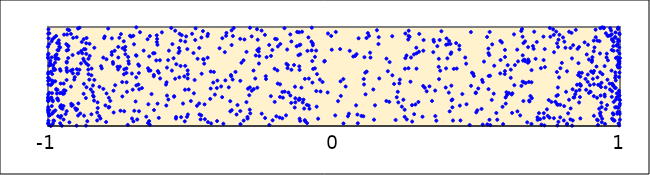
| Category | points |
|---|---|
| -0.43110661353062507 | 1.378 |
| -0.8675651230580735 | 1.282 |
| -0.565033645537927 | 1.827 |
| -0.8745556599280041 | 1.426 |
| 0.9229804409874507 | 1.01 |
| -0.5667209529932022 | 1.56 |
| 0.5402602000727939 | 1.373 |
| 0.9283016239833973 | 1.857 |
| 0.11427688111755352 | 1.549 |
| -0.8802029830275813 | 1.735 |
| -0.13521870981428483 | 1.239 |
| -0.693650932530248 | 1.248 |
| 0.9298636299498789 | 1.126 |
| 0.4291211683478396 | 1.58 |
| -0.1979750586562323 | 1.562 |
| 0.9655121116256414 | 1.913 |
| -0.20163071307384037 | 1.098 |
| 0.7329652501334318 | 1.666 |
| -0.5365397210138435 | 1.606 |
| -0.3020122885303584 | 1.075 |
| 0.46203699761014244 | 1.629 |
| -0.6910025675735528 | 1.41 |
| -0.5115081305963768 | 1.48 |
| 0.24951860649577548 | 1.686 |
| 0.8268158295402106 | 1.788 |
| 0.7798053604449524 | 1.835 |
| -0.72389746824894 | 1.346 |
| -0.059430127182583004 | 1.524 |
| -0.9358822513365613 | 1.827 |
| 0.5457070767478989 | 1.508 |
| 0.7602125747945597 | 1.243 |
| -0.9954528501858785 | 1.335 |
| -0.39467914654680825 | 1.4 |
| -0.12111763473503916 | 1.277 |
| 0.2643529150752365 | 1.901 |
| -0.9130697634604037 | 1.532 |
| -0.4097114934962796 | 1.383 |
| -0.19019378539580775 | 1.085 |
| -0.9140381414422669 | 1.717 |
| 0.391971669928768 | 1.821 |
| 0.13741860519871751 | 1.369 |
| -0.9746129210864114 | 1.452 |
| -0.6503048024994256 | 1.583 |
| -0.7037743616920243 | 1.367 |
| 0.4138486367704635 | 1.268 |
| -0.7466362189584752 | 1.154 |
| -0.9258246845231691 | 1.967 |
| 0.6954879357307139 | 1.807 |
| -0.9999643472417067 | 1.693 |
| 0.9461823946763345 | 1.605 |
| 0.9767737570285722 | 1.807 |
| -0.2878745427499838 | 1.905 |
| -0.8899368804248068 | 1.992 |
| 0.1064651614949364 | 1.695 |
| 0.8220247739148947 | 1.952 |
| -0.5127435108592436 | 1.777 |
| -0.25319050128932363 | 1.964 |
| 0.9726737033415093 | 1.424 |
| 0.8217623339778275 | 1.265 |
| -0.6160538501153433 | 1.555 |
| 0.0817571729877396 | 1.115 |
| -0.9983071085622521 | 1.053 |
| -0.9715411166750687 | 1.909 |
| 0.21003680179347411 | 1.425 |
| -0.22029689065771912 | 1.708 |
| 0.4959966378550189 | 1.338 |
| -0.9954261641146069 | 1.107 |
| 0.5158510821343923 | 1.172 |
| -0.6992822411084932 | 1.825 |
| -0.1373318168872886 | 1.187 |
| 0.9778900913636495 | 1.056 |
| 0.9108898288109826 | 1.794 |
| -0.8732922667616331 | 1.657 |
| -0.6086033877607829 | 1.664 |
| 0.6659633350788666 | 1.67 |
| -0.9997360395635095 | 1.156 |
| -0.88466739640617 | 1.632 |
| 0.5969960906201627 | 1.525 |
| -0.12021541724614296 | 1.074 |
| 0.46335042934097664 | 1.22 |
| 0.9083632721802629 | 1.302 |
| -0.9856212233762313 | 1.332 |
| 0.4014730843263877 | 1.337 |
| -0.586375928791623 | 1.207 |
| 0.7334828710127752 | 1.13 |
| -0.5525824709641152 | 1.075 |
| -0.5399672064739975 | 1.757 |
| 0.9081177428293162 | 1.862 |
| 0.5515000235370819 | 1.263 |
| -0.9780925233450233 | 1.893 |
| -0.8996970208587017 | 1.897 |
| 0.5872107218598053 | 1.844 |
| -0.629855485831215 | 1.517 |
| -0.12031767566631679 | 1.567 |
| -0.41650840865138145 | 1.317 |
| -0.6564040849399265 | 1.094 |
| -0.11827684891413738 | 1.051 |
| 0.998146878813159 | 1.14 |
| -0.281487159251752 | 1.56 |
| -0.4912603594669163 | 1.737 |
| -0.945547102944547 | 1.065 |
| 0.5893232563423979 | 1.194 |
| -0.948004987592298 | 1.324 |
| -0.8266352580266336 | 1.239 |
| -0.31640548037697175 | 1.664 |
| -0.8280807667589556 | 1.136 |
| 0.9712539520978312 | 1.926 |
| 0.9950394553546775 | 1.593 |
| -0.7335523302109845 | 1.149 |
| -0.974292670088214 | 1.711 |
| 0.9225467967567869 | 1.057 |
| -0.782071033040445 | 1.254 |
| -0.18847088031878506 | 1.421 |
| 0.8092729390998774 | 1.79 |
| 0.2951223380989953 | 1.243 |
| 0.9637414784206498 | 1.428 |
| -0.6813535657732642 | 1.371 |
| 0.6755489746414909 | 1.037 |
| 0.1581597281165125 | 1.48 |
| -0.1363889994465944 | 1.397 |
| -0.9916662427075587 | 1.66 |
| 0.5435240167062663 | 1.063 |
| 0.9951578138569918 | 1.026 |
| 0.9887358692526506 | 1.29 |
| 0.9436700528642976 | 1.993 |
| 0.8547593119233721 | 1.635 |
| -0.3406697499220785 | 1.116 |
| 0.9357702133013988 | 1.192 |
| -0.7485180475998339 | 1.6 |
| -0.9574333498311557 | 1.028 |
| 0.9853219565333995 | 1.46 |
| -0.7404588967708055 | 1.444 |
| 0.6573527268074749 | 1.98 |
| -0.5513640041710768 | 1.625 |
| 0.8613770342468582 | 1.076 |
| -0.9863831026081374 | 1.122 |
| 0.07724551194911104 | 1.209 |
| 0.6238190643890696 | 1.33 |
| -0.7198043532856785 | 1.697 |
| -0.9953199707859582 | 1.936 |
| -0.718665692767075 | 1.655 |
| -0.9787140916215684 | 1.053 |
| -0.7723822141728827 | 1.628 |
| -0.00972071948169034 | 1.91 |
| 0.07385244437410768 | 1.707 |
| 0.9319517861103074 | 1.136 |
| -0.16766245073408556 | 1.107 |
| -0.893687437413636 | 1.737 |
| -0.4407661772992247 | 1.931 |
| -0.07374978851323312 | 1.815 |
| 0.9824596125677713 | 1.891 |
| 0.24947272450914693 | 1.934 |
| -0.3817216647521416 | 1.746 |
| 0.27272398090176203 | 1.211 |
| 0.9089945965244346 | 1.556 |
| 0.2287039756227159 | 1.431 |
| -0.19660775239310205 | 1.428 |
| -0.27534240106368907 | 1.48 |
| 0.7507187546833062 | 1.262 |
| -0.9450609063819246 | 1.429 |
| -0.4873364716476675 | 1.465 |
| 0.9823601429441684 | 1.384 |
| 0.99159196730358 | 1.823 |
| -0.32762268218507296 | 1.151 |
| -0.5594500395982299 | 1.297 |
| -0.8427191709987669 | 1.409 |
| -0.6503629297116409 | 1.031 |
| 0.3694229655405735 | 1.869 |
| 0.4101027049744108 | 1.743 |
| -0.07596681293652034 | 1.656 |
| 0.9711669010335852 | 1.294 |
| -0.17247655738904175 | 1.347 |
| 0.5401407044855223 | 1.736 |
| -0.7731592716414425 | 1.646 |
| 0.1882613867004229 | 1.553 |
| -0.49632994168773 | 1.932 |
| -0.9841608553284994 | 1.26 |
| -0.523323538759547 | 1.501 |
| -0.19610663425790018 | 1.804 |
| -0.9441442149177174 | 1.361 |
| 0.8435448104363412 | 1.321 |
| -0.8738849538497535 | 1.104 |
| 0.25445054445177323 | 1.067 |
| -0.9573218243586721 | 1.198 |
| 0.9907926772011564 | 1.612 |
| 0.36645969099130105 | 1.678 |
| -0.9333052610892207 | 1.924 |
| -0.2806355739284743 | 1.373 |
| -0.9645541686292801 | 1.1 |
| -0.22663370900388372 | 1.819 |
| 0.5430980990623235 | 1.716 |
| -0.7017464002223569 | 1.911 |
| -0.31578956705499717 | 1.054 |
| -0.9897912437709727 | 1.283 |
| 0.9973558956088305 | 1.31 |
| 0.39172008254338914 | 1.582 |
| 0.4791910688125067 | 1.406 |
| -0.1807837620359922 | 1.077 |
| -0.806814315865005 | 1.691 |
| 0.4102572778926651 | 1.407 |
| 0.9762919051924148 | 1.063 |
| -0.1213451535502932 | 1.603 |
| 0.26120941099356215 | 1.962 |
| 0.7685453768464536 | 1.92 |
| 0.4786629569993925 | 1.948 |
| -0.5689955922423272 | 1.99 |
| 0.6641865552377106 | 1.44 |
| 0.8949185946908791 | 1.346 |
| 0.9933209402023877 | 1.593 |
| -0.08584744038228985 | 1.174 |
| -0.35795363300329 | 1.966 |
| 0.9722512690500547 | 1.351 |
| -0.816436442494528 | 1.076 |
| 0.9087364272972669 | 1.103 |
| 0.9538336518018019 | 1.73 |
| 0.9499537052287352 | 1.17 |
| 0.9703511573240465 | 1.56 |
| 0.0326893911702987 | 1.474 |
| 0.8377034150522271 | 1.288 |
| 0.9013718833368475 | 1.648 |
| 0.5584842250219968 | 1.327 |
| -0.046894413456895476 | 1.349 |
| 0.6835323258096685 | 1.248 |
| 0.2373146647069223 | 1.195 |
| -0.9989676665276168 | 1.028 |
| -0.17858496128520157 | 1.286 |
| -0.4327347442034078 | 1.274 |
| -0.9606803185840291 | 1.802 |
| -0.6913338617347558 | 1.997 |
| -0.3274986577802649 | 1.456 |
| -0.9996998061715541 | 1.275 |
| -0.6017299698811726 | 1.946 |
| -0.6197795710773939 | 1.916 |
| -0.5608710064515763 | 1.684 |
| -0.9980046492918315 | 1.886 |
| 0.3578218488538949 | 1.054 |
| 0.6005429758937104 | 1.226 |
| -0.16620496485601446 | 1.628 |
| -0.9119753645611566 | 1.89 |
| 0.9730298778731781 | 1.427 |
| 0.7739406952255395 | 1.244 |
| 0.859970851965703 | 1.292 |
| 0.37142533050676074 | 1.559 |
| -0.9664563317015871 | 1.767 |
| 0.9771452565173765 | 1.409 |
| 0.10273213279163933 | 1.098 |
| -0.7400801029654582 | 1.298 |
| -0.6817579265028768 | 1.149 |
| -0.6441644133981259 | 1.013 |
| -0.3868018207700329 | 1.023 |
| -0.26803466458699743 | 1.766 |
| -0.974931344212361 | 1.57 |
| -0.9002089236208274 | 1.003 |
| -0.952015145878257 | 1.337 |
| 0.8464609660217491 | 1.351 |
| -0.15286039580357652 | 1.925 |
| -0.4554872360973859 | 1.671 |
| 0.3613995928236022 | 1.807 |
| 0.8049325963751053 | 1.201 |
| 0.9919384539104723 | 1.142 |
| 0.10393840250390084 | 1.474 |
| 0.11371312670020242 | 1.889 |
| -0.10936207688327931 | 1.238 |
| 0.3934332923788373 | 1.885 |
| 0.866753154192793 | 1.537 |
| -0.04934103254868296 | 1.469 |
| 0.6182767475377758 | 1.569 |
| -0.9137341209585091 | 1.212 |
| 0.5817082963006839 | 1.86 |
| 0.8761971918437386 | 1.845 |
| 0.9965067494341865 | 1.494 |
| 0.44873062343342607 | 1.323 |
| 0.9034809606423204 | 1.695 |
| -0.26250415542352845 | 1.781 |
| -0.29400439212076296 | 1.39 |
| -0.7351788440683398 | 1.856 |
| -0.9818674524030978 | 1.137 |
| -0.9751747583959162 | 1.641 |
| 0.8350154421738645 | 1.056 |
| -0.9864628291041644 | 1.426 |
| 0.3338910638032207 | 1.4 |
| -0.9622377431371294 | 1.865 |
| 0.014110767125181653 | 1.251 |
| -0.30610284764633516 | 1.241 |
| -0.4838874885892624 | 1.986 |
| 0.15636137719492282 | 1.897 |
| -0.12416881627641192 | 1.715 |
| -0.13062524108192147 | 1.805 |
| 0.2470369275274601 | 1.164 |
| -0.5554580062661751 | 1.477 |
| -0.10217358143491427 | 1.059 |
| 0.1093473103488723 | 1.539 |
| -0.062486996320109296 | 1.762 |
| -0.8401730748641456 | 1.297 |
| -0.52795295023756 | 1.227 |
| -0.725112075278887 | 1.442 |
| -0.489844737665879 | 1.33 |
| -0.9187060768651933 | 1.224 |
| -0.9956784867525272 | 1.827 |
| 0.9269624917527208 | 1.174 |
| 0.5530966179173962 | 1.824 |
| -0.07769768908978857 | 1.993 |
| 0.004274529784121353 | 1.107 |
| 0.7359217265969468 | 1.006 |
| -0.8063935170767577 | 1.375 |
| 0.7768679544108034 | 1.953 |
| 0.7661925977038997 | 1.976 |
| 0.6595040154570438 | 1.448 |
| -0.8039454297079232 | 1.887 |
| 0.2693034250152727 | 1.691 |
| 0.5977473533585906 | 1.555 |
| -0.3579874608522647 | 1.818 |
| -0.7391254785789739 | 1.786 |
| 0.12614114696458864 | 1.741 |
| -0.36275966411339844 | 1.251 |
| 0.41400802986279533 | 1.189 |
| -0.12881332164546247 | 1.95 |
| 0.18347106260138663 | 1.68 |
| 0.9962342403281935 | 1.337 |
| -0.7878561348278905 | 1.187 |
| 0.9721120482268213 | 1.876 |
| 0.4043516672168804 | 1.148 |
| -0.6518760263453811 | 1.877 |
| -0.7771567346794019 | 1.719 |
| -0.9999910727218715 | 1.289 |
| 0.978056485265925 | 1.243 |
| -0.8584962404575097 | 1.678 |
| 0.560245798628064 | 1.609 |
| -0.6301031254105608 | 1.502 |
| -0.5522035259694906 | 1.091 |
| -0.5169294442998091 | 1.905 |
| -0.6184691631938011 | 1.879 |
| -0.8503611795558212 | 1.369 |
| -0.9991552291877921 | 1.933 |
| -0.7547865347374965 | 1.571 |
| -0.7311460812762605 | 1.767 |
| -0.9633909715275035 | 1.765 |
| -0.8654653171028994 | 1.392 |
| -0.8146561456546912 | 1.604 |
| 0.9930512708198288 | 1.873 |
| 0.9314893143002467 | 1.988 |
| -0.8938729594726316 | 1.228 |
| -0.842505516206906 | 1.307 |
| -0.2735678907798337 | 1.712 |
| 0.9362645267973434 | 1.038 |
| 0.9954576733430136 | 1.664 |
| -0.9332094786128586 | 1.548 |
| 0.6073817977542978 | 1.614 |
| -0.9903793966606715 | 1 |
| 0.6598040944683583 | 1.714 |
| 0.9966107560968214 | 1.861 |
| 0.3537384685581206 | 1.358 |
| 0.9933041930470073 | 1.851 |
| 0.8115162962833109 | 1.345 |
| 0.9505176503139647 | 1.937 |
| -0.2680929785521744 | 1.387 |
| -0.9344270567266466 | 1.562 |
| 0.1944901207709519 | 1.645 |
| -0.20763038413155893 | 1.578 |
| 0.504371226027156 | 1.379 |
| 0.567666580065673 | 1.132 |
| 0.2470560523711907 | 1.093 |
| -0.7345041967608755 | 1.522 |
| 0.31193671678413 | 1.404 |
| -0.9699127291171105 | 1.723 |
| 0.8147380344928303 | 1.014 |
| -0.9205924602520713 | 1.558 |
| -0.6982231856670497 | 1.153 |
| -0.984392875178889 | 1.876 |
| 0.5009973023501543 | 1.158 |
| -0.8481046902681119 | 1.513 |
| -0.48514245632203146 | 1.869 |
| 0.07889504755166069 | 1.726 |
| -0.9927136920992174 | 1.468 |
| -0.5419916259902133 | 1.789 |
| 0.2802966755044884 | 1.119 |
| -0.5792541201763836 | 1.267 |
| -0.9809550576982885 | 1.055 |
| -0.40873335796004806 | 1.05 |
| -0.543498851518653 | 1.738 |
| -0.9516767455591499 | 1.003 |
| -0.584040956641289 | 1.59 |
| -0.9537699905920448 | 1.21 |
| 0.9889165909889898 | 1.33 |
| 0.9916749683808332 | 1.76 |
| -0.3911068417576902 | 1.291 |
| -0.29455831429871204 | 1.165 |
| -0.45714514163675196 | 1.675 |
| 0.41872070569264597 | 1.577 |
| 0.26034570132056756 | 1.583 |
| 0.31325426545308716 | 1.868 |
| -0.8992109552942142 | 1.574 |
| 0.24808826478789844 | 1.578 |
| -0.729436205462836 | 1.725 |
| -0.09492678743275693 | 1.214 |
| 0.9987093918892583 | 1.927 |
| -0.8665903269505881 | 1.632 |
| -0.9874035893486147 | 1.856 |
| -0.5216370469849716 | 1.047 |
| -0.7448654170872467 | 1.929 |
| -0.8951418579512452 | 1.985 |
| 0.24260025066407054 | 1.265 |
| -0.7012529793380222 | 1.047 |
| -0.4627432274140585 | 1.528 |
| -0.9292433899393814 | 1.687 |
| -0.9970141751531738 | 1.257 |
| -0.14908571958224798 | 1.854 |
| -0.47024915965598807 | 1.116 |
| -0.46640231240042934 | 1.067 |
| -0.15242593224931295 | 1.308 |
| -0.29277500391607303 | 1.128 |
| -0.40772493796662984 | 1.459 |
| -0.6823149659410563 | 1.535 |
| -0.6782862815364921 | 1.947 |
| -0.8968849664400012 | 1.53 |
| 0.342719555259247 | 1.253 |
| -0.9968185661798917 | 1.123 |
| 0.5464148641486289 | 1.009 |
| 0.9999477798273214 | 1.261 |
| -0.8119712950787253 | 1.582 |
| -0.05548254691344489 | 1.074 |
| 0.7917004797018031 | 1.584 |
| 0.8988587967522161 | 1.551 |
| 0.05207078288195826 | 1.124 |
| 0.3542145392577956 | 1.101 |
| -0.07301626303923525 | 1.577 |
| -0.4636097481890704 | 1.893 |
| 0.9710967038967346 | 1.768 |
| 0.9476146905403481 | 1.021 |
| 0.937738181312039 | 1.996 |
| -0.2962652951935015 | 1.311 |
| 0.621212437725728 | 1.319 |
| 0.26740292710748 | 1.447 |
| -0.9993097395071486 | 1.487 |
| 0.8539767316552259 | 1.515 |
| 0.3906265731728773 | 1.388 |
| 0.6813255277632846 | 1.445 |
| 0.2885671383494627 | 1.734 |
| 0.04074482053944721 | 1.399 |
| -0.8754189917906742 | 1.325 |
| -0.9677182378671876 | 1.277 |
| 0.9841780810429905 | 1.945 |
| 0.955013110292872 | 1.211 |
| -0.0744139935621312 | 1.834 |
| -0.706560984122548 | 1.53 |
| -0.1803982632252392 | 1.344 |
| 0.4159691390608392 | 1.055 |
| -0.8741972354642118 | 1.776 |
| -0.6714469426619607 | 1.383 |
| 0.991441508319422 | 1.695 |
| 0.6553025216128916 | 1.405 |
| -0.8949420197223121 | 1.106 |
| 0.08318598080659707 | 1.028 |
| 0.8624139506304787 | 1.412 |
| 0.9300903708840822 | 1.733 |
| 0.678637960288275 | 1.796 |
| -0.6905608387719678 | 1.71 |
| -0.8581794887224845 | 1.523 |
| -0.10047627654978925 | 1.047 |
| -0.8208474316847707 | 1.101 |
| 0.9529612467600393 | 1.693 |
| 0.8454482932875669 | 1.971 |
| 0.6293757149800862 | 1.926 |
| -0.9345401693011139 | 1.763 |
| -0.5799782384176351 | 1.665 |
| -0.021067941661173397 | 1.934 |
| 0.6413801083199803 | 1.148 |
| 0.9902434323894701 | 1.124 |
| -0.999927342423154 | 1.255 |
| -0.8547468875319925 | 1.83 |
| -0.5875581280927819 | 1.419 |
| 0.8912567481976925 | 1.334 |
| -0.6169999734995649 | 1.226 |
| -0.7766224522413876 | 1.885 |
| -0.9782873669681214 | 1.565 |
| -0.16381427005017565 | 1.772 |
| -0.9831177374774159 | 1.439 |
| 0.8362010754970619 | 1.816 |
| -0.7992507945229245 | 1.208 |
| -0.6126879851253287 | 1.537 |
| 0.9325004603262506 | 1.101 |
| 0.6226979142262538 | 1.132 |
| -0.5209642599671491 | 1.366 |
| -0.5587509910234111 | 1.3 |
| -0.9978166566361972 | 1.484 |
| -0.3236475107932749 | 1.639 |
| 0.9829809983525116 | 1.488 |
| 0.12766462992433175 | 1.691 |
| -0.9992016852991381 | 1.319 |
| 0.779213510364138 | 1.546 |
| 0.3660928072596453 | 1.598 |
| 0.997249935738251 | 1.794 |
| -0.9893660527088086 | 1.618 |
| -0.7063132974866355 | 1.075 |
| -0.9999660389080288 | 1.801 |
| 0.8627748070079422 | 1.407 |
| -0.5363972134958175 | 1.863 |
| -0.24149683185661777 | 1.921 |
| 0.4400943443170008 | 1.206 |
| -0.9010127107475413 | 1.161 |
| -0.9458159888835085 | 1.202 |
| 0.9749140158089197 | 1.128 |
| -0.9829492098726095 | 1.024 |
| 0.691877669463342 | 1.281 |
| 0.6625992426335098 | 1.838 |
| -0.6655767935188049 | 1.761 |
| 0.9376769676138397 | 1.074 |
| -0.7543575643381665 | 1.799 |
| -0.3760139280419895 | 1.94 |
| 0.9772343214737346 | 1.76 |
| -0.9731071045291854 | 1.677 |
| -0.9083797047524189 | 1.469 |
| 0.938672801212111 | 1.523 |
| 0.5352819311139156 | 1.899 |
| -0.34436959932108835 | 1.546 |
| -0.9138022838055766 | 1.569 |
| 0.914633952951666 | 1.973 |
| 0.8146830524106091 | 1.552 |
| -0.2875600976447335 | 1.356 |
| -0.992869752448392 | 1.637 |
| -0.9344428807383703 | 1.64 |
| -0.6326162010520785 | 1.734 |
| -0.35762388353936014 | 1.16 |
| 0.7835606230193695 | 1.798 |
| -0.13517226986939557 | 1.28 |
| 0.9468063747135925 | 1.299 |
| -0.4791742230113522 | 1.204 |
| -0.8555109305186173 | 1.468 |
| 0.9199109360433668 | 1.285 |
| -0.3373780232484978 | 1.212 |
| -0.890047223303669 | 1.568 |
| 0.28830580461260197 | 1.579 |
| 0.5811665146894854 | 1.531 |
| -0.934654243414466 | 1.15 |
| 0.22477910062624865 | 1.239 |
| -0.8650978147833057 | 1.889 |
| 0.69044917224509 | 1.021 |
| 0.9972045621414644 | 1.007 |
| 0.9688530203047088 | 1.965 |
| 0.7827702121937301 | 1.389 |
| 0.02392198761391631 | 1.304 |
| -0.2612050595878621 | 1.706 |
| 0.15011345787612398 | 1.967 |
| 0.9495695020046968 | 1.39 |
| -0.956130926573564 | 1.558 |
| 0.7689290721790473 | 1.079 |
| -0.5325456673213178 | 1.917 |
| 0.5708504088751432 | 1.063 |
| -0.7504635588234433 | 1.891 |
| -0.11935089976144969 | 1.269 |
| -0.88398281771672 | 1.757 |
| -0.3269442470162636 | 1.019 |
| 0.6593120014740106 | 1.902 |
| 0.23036381381963386 | 1.469 |
| 0.1554853042726548 | 1.828 |
| 0.03314889707053818 | 1.026 |
| -0.8764533054034561 | 1.679 |
| 0.9872604373795502 | 1.191 |
| -0.7296276214877346 | 1.8 |
| 0.8266419038895952 | 1.067 |
| 0.9985781608201354 | 1.209 |
| 0.883750351050282 | 1.723 |
| -0.5853398471684271 | 1.441 |
| 0.3479421801248333 | 1.87 |
| -0.09410302601172221 | 1.029 |
| 0.8870722305230151 | 1.446 |
| 0.04877757711809636 | 1.099 |
| -0.7871826971874075 | 1.285 |
| 0.6116541923678466 | 1.332 |
| 0.4974899891219281 | 1.138 |
| -0.9686675597315206 | 1.685 |
| -0.033794898644011535 | 1.651 |
| 0.9981867860616576 | 1.732 |
| 0.998241097317301 | 1.54 |
| -0.8625573874096385 | 1.048 |
| 0.9847759153859195 | 1.385 |
| 0.7546379166252316 | 1.99 |
| 0.32402259633167974 | 1.35 |
| 0.781914401548916 | 1.213 |
| 0.6824649302643038 | 1.257 |
| 0.7693760330327354 | 1.745 |
| -0.8434253392109258 | 1.342 |
| -0.29363312073982106 | 1.992 |
| 0.7339807079673207 | 1.082 |
| 0.517872815544883 | 1.466 |
| -0.9819793316285673 | 1.614 |
| -0.09275103215467854 | 1.759 |
| 0.7811971507042386 | 1.005 |
| 0.8567907329621085 | 1.798 |
| 0.7909894948042377 | 1.215 |
| 0.8613757345482818 | 1.498 |
| -0.9982547354908237 | 1.73 |
| 0.5999658117237425 | 1.288 |
| -0.9989960671749828 | 1.542 |
| -0.7668429493911949 | 1.76 |
| -0.8690669237996338 | 1.776 |
| 0.9847444262648221 | 1.509 |
| -0.9992833967950202 | 1.19 |
| -0.9687203854783502 | 1.329 |
| -0.9297236005466109 | 1.811 |
| 0.2733503416672558 | 1.045 |
| 0.9195988309702744 | 1.064 |
| 0.7376069668079859 | 1.595 |
| 0.9944120245132353 | 1.66 |
| -0.8542299632914239 | 1.708 |
| -0.9997614412796988 | 1.686 |
| 0.8320110081847037 | 1.683 |
| -0.5141014161618882 | 1.092 |
| -0.9870055708441984 | 1.693 |
| -0.9845488871774387 | 1.458 |
| 0.7849879206429281 | 1.872 |
| -0.4714639172437137 | 1.228 |
| -0.07814320741646859 | 1.763 |
| 0.9973707159485036 | 1.267 |
| -0.8592281918109247 | 1.57 |
| -0.733336714909764 | 1.572 |
| 0.1398861379059013 | 1.064 |
| -0.08945670332737281 | 1.895 |
| 0.7908901806387458 | 1.088 |
| 0.8516903554234445 | 1.779 |
| -0.45379467201296975 | 1.629 |
| -0.1397362857632896 | 1.616 |
| 0.7565516356913717 | 1.901 |
| -0.390469107618288 | 1.887 |
| -0.04014555275623403 | 1.444 |
| -0.6845580436976241 | 1.621 |
| 0.7779733335839051 | 1.304 |
| 0.894726218264674 | 1.413 |
| -0.07907946801499814 | 1.853 |
| 0.8584553433702753 | 1.364 |
| -0.10190046926057077 | 1.476 |
| 0.9589131567638701 | 1.911 |
| 0.977344009237952 | 1.116 |
| -0.5116171068139359 | 1.561 |
| -0.6915732261518385 | 1.491 |
| -0.9896028835093081 | 1.548 |
| -0.20024111471833947 | 1.876 |
| -0.8945166675456631 | 1.53 |
| -0.5838926163422926 | 1.307 |
| -0.938426007736971 | 1.121 |
| 0.26062724622489186 | 1.91 |
| 0.9436362559549734 | 1.989 |
| 0.7114097535690522 | 1.087 |
| 0.6704600080092684 | 1.434 |
| 0.9334772388557798 | 1.393 |
| -0.20607347449784646 | 1.88 |
| -0.7570765614613572 | 1.598 |
| -0.06661584336220086 | 1.582 |
| 0.7846621567276354 | 1.042 |
| -0.9197410171078673 | 1.398 |
| 0.9089575586735058 | 1.421 |
| 0.9207335752858443 | 1.863 |
| 0.6979705372844941 | 1.779 |
| -0.18883840242792485 | 1.294 |
| 0.2796121903362587 | 1.723 |
| -0.3678837732950837 | 1.39 |
| 0.6509773348918592 | 1.107 |
| -0.4582239192879751 | 1.959 |
| -0.9634056729673572 | 1.678 |
| -0.9998325688369252 | 1.168 |
| 0.19325243470007106 | 1.244 |
| -0.12355799084099349 | 1.263 |
| -0.21468724283547438 | 1.058 |
| -0.7702740363231727 | 1.137 |
| -0.4407378307709266 | 1.039 |
| 0.8324992300414173 | 1.003 |
| -0.23567259018079298 | 1.695 |
| 0.997717213214053 | 1.63 |
| 0.1832265213717561 | 1.253 |
| -0.7257778259421102 | 1.536 |
| -0.061875173167907256 | 1.353 |
| -0.8819669703358182 | 1.849 |
| -0.9580091334335642 | 1.573 |
| -0.6172862560050855 | 1.82 |
| 0.6905883662406448 | 1.442 |
| 0.6046231740239145 | 1.311 |
| 0.11025360897465673 | 1.32 |
| -0.95698645333536 | 1.085 |
| -0.9710329848967221 | 1.374 |
| -0.9389606770222896 | 1.357 |
| -0.9313679849004718 | 1.974 |
| -0.9799391650583444 | 1.585 |
| -0.6474221759134633 | 1.559 |
| -0.2074039336858992 | 1.244 |
| 0.6324757496862465 | 1.615 |
| -0.5107851123552956 | 1.116 |
| -0.4200335078125359 | 1.546 |
| -0.6924993930377669 | 1.714 |
| 0.4867048297822606 | 1.529 |
| -0.9982635336708664 | 1.977 |
| -0.8390736710665966 | 1.257 |
| -0.7769448479181562 | 1.747 |
| 0.37555122088045123 | 1.957 |
| -0.16246316126805893 | 1.584 |
| -0.9868550189710779 | 1.201 |
| -0.5201041202294417 | 1.607 |
| 0.9236894805139774 | 1.416 |
| -0.16134493515943307 | 1.615 |
| -0.21564417668235342 | 1.768 |
| -0.8672079098425756 | 1.004 |
| 0.9211630138901171 | 1.491 |
| -0.8984724855885744 | 1.169 |
| 0.5914422583829296 | 1.019 |
| -0.2692600771340881 | 1.978 |
| -0.9740368908810126 | 1.693 |
| -0.22612147599303511 | 1.01 |
| 0.9972655635547695 | 1.935 |
| 0.6306518221129767 | 1.412 |
| -0.14891081502142084 | 1.568 |
| 0.31236845210450903 | 1.761 |
| -0.9575845850206003 | 1.793 |
| -0.36259246834853615 | 1.148 |
| -0.641776483055899 | 1.56 |
| -0.26331435621366506 | 1.752 |
| -0.6292972194100042 | 1.161 |
| -0.9906818898291627 | 1.413 |
| 0.2036304052033043 | 1.907 |
| 0.980951300612667 | 1.055 |
| -0.9678689731322173 | 1.84 |
| 0.8009208701226541 | 1.894 |
| -0.4295964535401545 | 1.026 |
| 0.3175451566786428 | 1.386 |
| 0.9560857700764605 | 1.468 |
| 0.9926253652973606 | 1.979 |
| -0.8475030163147249 | 1.58 |
| -0.995581878254738 | 1.61 |
| 0.4382179602210061 | 1.774 |
| 0.8597521398592777 | 1.424 |
| -0.8380128612632937 | 1.79 |
| -0.9955885618572639 | 1.161 |
| 0.6685654594960343 | 1.654 |
| 0.9977762608378165 | 1.653 |
| 0.7166043871840402 | 1.13 |
| 0.8794600267833672 | 1.475 |
| 0.7825073258280838 | 1.313 |
| 0.6179818535811598 | 1.487 |
| -0.7541877896003092 | 1.692 |
| -0.9063969110720147 | 1.493 |
| -0.1216740625391325 | 1.947 |
| 0.8497605817038939 | 1.417 |
| -0.8751397661197096 | 1.877 |
| 0.30945661362729426 | 1.093 |
| 0.725385125527704 | 1.014 |
| 0.93213484363531 | 1.308 |
| 0.9938118315616273 | 1.994 |
| -0.4425175001239536 | 1.908 |
| -0.9349219685289983 | 1.465 |
| 0.8186454333857361 | 1.128 |
| -0.08830040985926041 | 1.207 |
| -0.6435511153796695 | 1.909 |
| 0.2845565310924461 | 1.217 |
| -0.2528225266951981 | 1.125 |
| -0.8663363571879935 | 1.836 |
| -0.5112627462172162 | 1.523 |
| -0.12179543440038217 | 1.815 |
| -0.9879726440165357 | 1.286 |
| 0.9722824952618351 | 1.074 |
| -0.471104095380732 | 1.789 |
| -0.7134253917655545 | 1.911 |
| -0.4001816316192609 | 1.785 |
| 0.6548794159716751 | 1.959 |
| -0.08795263506644682 | 1.479 |
| -0.9611704971430826 | 1.833 |
| 0.2536103180734326 | 1.712 |
| -0.9294147807188609 | 1.77 |
| 0.9850125413000889 | 1.265 |
| -0.159154233814768 | 1.338 |
| -0.1494217008571504 | 1.234 |
| -0.94392013085392 | 1.923 |
| 0.20414526848939307 | 1.512 |
| -0.8591874051232253 | 1.615 |
| -0.9286793891862223 | 1.806 |
| -0.6379513552171893 | 1.323 |
| 0.7089660788658048 | 1.849 |
| -0.022151767198828116 | 1.339 |
| 0.6434281005486926 | 1.652 |
| -0.30096010497760634 | 1.377 |
| -0.96708369357191 | 1.365 |
| -0.5345914001197936 | 1.089 |
| 0.7535793432852391 | 1.084 |
| -0.8872936739830027 | 1.127 |
| -0.43096022350284613 | 1.55 |
| 0.9855596794344954 | 1.687 |
| 0.48891620381834205 | 1.506 |
| 0.1434007423567164 | 1.209 |
| -0.10654424439050864 | 1.267 |
| 0.9730227282482216 | 1.869 |
| -0.5398816396017759 | 1.931 |
| -0.7089040150626972 | 1.902 |
| -0.4515417213154663 | 1.069 |
| -0.7857589172621503 | 1.192 |
| 0.7966480957816693 | 1.637 |
| 0.9987399887937396 | 1.594 |
| 0.5443192405730053 | 1.95 |
| -0.999148388031391 | 1.139 |
| 0.8881623148993484 | 1.82 |
| -0.9584986902969447 | 1.332 |
| -0.11396192037643132 | 1.387 |
| -0.6839193799159461 | 1.419 |
| 0.8574424044224318 | 1.538 |
| -0.220804910928096 | 1.301 |
| -0.9197297870685605 | 1.93 |
| 0.744533382018619 | 1.168 |
| 0.21549100237554394 | 1.061 |
| -0.7650203844005543 | 1.412 |
| 0.7048573594160267 | 1.678 |
| -0.17309315446875667 | 1.988 |
| -0.5407860379546836 | 1.492 |
| -0.9993758970634389 | 1.253 |
| 0.9082725195670517 | 1.755 |
| -0.4642221007517488 | 1.107 |
| -0.9350063468606491 | 1.585 |
| 0.8971398343654183 | 1.344 |
| 0.9836712794276498 | 1.542 |
| 0.4825712640056327 | 1.538 |
| -0.9797304495290867 | 1.145 |
| -0.5078969941901903 | 1.369 |
| 0.999743861053175 | 1.064 |
| -0.974378284098677 | 1.157 |
| -0.07539275479498292 | 1.438 |
| 0.43819584292490693 | 1.813 |
| 0.840387213063008 | 1.289 |
| -0.30589344386786255 | 1.749 |
| -0.4221250563507045 | 1.439 |
| -0.5770881770991645 | 1.761 |
| -0.2386145894284942 | 1.503 |
| 0.36724434414350676 | 1.473 |
| -0.9994968153178676 | 1.526 |
| -0.3130429723738133 | 1.874 |
| 0.5978051912707538 | 1.769 |
| -0.7172699542841584 | 1.63 |
| 0.987917949480933 | 1.812 |
| -0.6462984063474633 | 1.05 |
| 0.7801171986775606 | 1.221 |
| 0.9062396531656265 | 1.536 |
| 0.917791905313347 | 1.601 |
| 0.2194417621817584 | 1.29 |
| 0.5980104918689274 | 1.697 |
| -0.11775753073359405 | 1.821 |
| -0.9793569494233738 | 1.571 |
| 0.935436924127269 | 1.436 |
| 0.9987691138551693 | 1.121 |
| 0.9974043411737129 | 1.646 |
| 0.8304697192617925 | 1.941 |
| -0.9829186696097015 | 1.249 |
| 0.9656871142154928 | 1.988 |
| -0.8261417236771346 | 1.182 |
| -0.10446799815358437 | 1.176 |
| 0.8569743143975074 | 1.238 |
| -0.5552629295538201 | 1.963 |
| -0.8660771125378847 | 1.728 |
| -0.7213252762324649 | 1.011 |
| 0.8342537331227498 | 1.371 |
| 0.9565185345545786 | 1.912 |
| 0.9305314379739059 | 1.542 |
| 0.42701124694930187 | 1.837 |
| -0.6079592262177507 | 1.48 |
| -0.9556256751892849 | 1.184 |
| 0.6405326047260032 | 1.771 |
| -0.646039396593188 | 1.703 |
| -0.4769493806091829 | 1.679 |
| 0.5244546115694735 | 1.651 |
| 0.9577843371272928 | 1.663 |
| -0.6215665460003466 | 1.663 |
| -0.7952871656926648 | 1.329 |
| 0.4742074834348875 | 1.01 |
| -0.3542930074447206 | 1.469 |
| -0.6880484506221775 | 1.066 |
| 0.8914244438166985 | 1.671 |
| 0.9464382454874938 | 1.318 |
| -0.9995564905949559 | 1.025 |
| 0.054943977700094 | 1.759 |
| 0.4588527314563858 | 1.691 |
| -0.06654156140691546 | 1.699 |
| 0.9835640595762293 | 1.899 |
| 0.7883033304618284 | 1.921 |
| -0.4417252896532016 | 1.69 |
| -0.8281975344019402 | 1.056 |
| 0.5202044302741957 | 1.444 |
| 0.6907128598133316 | 1.564 |
| -0.999996998944644 | 1.721 |
| -0.6273764524960722 | 1.736 |
| 0.8874258139790709 | 1.519 |
| 0.5200362344127796 | 1.014 |
| 0.9760209825311007 | 1.406 |
| -0.9667046244109065 | 1.277 |
| 0.9021299904242814 | 1.665 |
| -0.24091180813699442 | 1.081 |
| -0.8016769145057854 | 1.904 |
| 0.40793607564375517 | 1.728 |
| 0.5398837877930074 | 1.782 |
| 0.02160364692433828 | 1.777 |
| -0.5201652123680045 | 1.853 |
| -0.18774511813628716 | 1.828 |
| -0.9994622891201713 | 1.456 |
| 0.7119724694034091 | 1.062 |
| 0.006396024299515985 | 1.95 |
| 0.5359974693607497 | 1.017 |
| -0.9976885260009314 | 1.017 |
| 0.7323468315611168 | 1.903 |
| 0.40249421712384975 | 1.859 |
| -0.7710765946164656 | 1.357 |
| -0.6126766108988977 | 1.082 |
| 0.7367327931606976 | 1.777 |
| 0.2594860915714194 | 1.874 |
| 0.9151455419269073 | 1.897 |
| -0.3602129626261309 | 1.515 |
| 0.662214578984107 | 1.252 |
| -0.9345717769624949 | 1.649 |
| -0.9642420106244952 | 1.258 |
| -0.2667600561145562 | 1.871 |
| 0.9776230701863964 | 1.851 |
| -0.7967396859491519 | 1.04 |
| 0.8274929196934104 | 1.178 |
| 0.22290936581145057 | 1.345 |
| 0.6999393038796997 | 1.952 |
| 0.7869162853219802 | 1.49 |
| -0.3508456607496959 | 1.99 |
| 0.679146857521562 | 1.671 |
| -0.23753993322300931 | 1.474 |
| -0.35939024068427805 | 1.503 |
| 0.8814307438819239 | 1.366 |
| 0.02289495508279726 | 1.451 |
| 0.9931536646619714 | 1.182 |
| 0.9999998553721856 | 1.685 |
| -0.06066586483478523 | 1.195 |
| -0.9706750031627593 | 1.366 |
| 0.6681201486692062 | 1.855 |
| 0.11824639091336633 | 1.939 |
| 0.9955056664601067 | 1.635 |
| 0.34961697782911505 | 1.852 |
| 0.6817400402153593 | 1.652 |
| -0.9436035623399132 | 1.329 |
| 0.3964185824546637 | 1.683 |
| -0.32796504500706697 | 1.88 |
| -0.03251443976262697 | 1.657 |
| 0.9286089850679782 | 1.415 |
| -0.30261162935162195 | 1.091 |
| -0.9947868952421065 | 1.106 |
| 0.06734919181170838 | 1.702 |
| -0.9986833181564422 | 1.42 |
| 0.6609883188298683 | 1.661 |
| -0.8379061527175514 | 1.466 |
| 0.2981883448674409 | 1.93 |
| -0.00787947923346865 | 1.771 |
| -0.11166346408151187 | 1.952 |
| 0.805412675229579 | 1.851 |
| 0.9051815007592583 | 1.476 |
| -0.9175051094354614 | 1.204 |
| -0.7896303592580469 | 1.984 |
| -0.8482747111164815 | 1.118 |
| -0.8201226644952787 | 1.396 |
| 0.1224405508697666 | 1.911 |
| -0.7954532499522453 | 1.674 |
| 0.6868668756019266 | 1.303 |
| -0.37741287814639746 | 1.911 |
| 0.442108741197847 | 1.056 |
| 0.3986135580463187 | 1.826 |
| 0.347199066409543 | 1.746 |
| 0.7234641802875513 | 1.584 |
| -0.9537867974081788 | 1.102 |
| 0.9649305573499778 | 1.368 |
| -0.9555799182786923 | 1.429 |
| -0.500546109718611 | 1.252 |
| -0.26240980180065787 | 1.631 |
| 0.2969811193235066 | 1.75 |
| 0.4111678810593602 | 1.259 |
| -0.11801825542686745 | 1.724 |
| 0.5824047418705937 | 1.666 |
| 0.8036497796150622 | 1.056 |
| 0.5408673829952253 | 1.505 |
| -0.9970556279522856 | 1.121 |
| 0.08595699887587757 | 1.886 |
| 0.9829162749238025 | 1.188 |
| 0.6031578318946403 | 1.341 |
| 0.40711262117471736 | 1.829 |
| -0.9493968929574279 | 1.173 |
| 0.7209495115324156 | 1.069 |
| -0.6812482351607945 | 1.608 |
| 0.9964573838634639 | 1.357 |
| 0.9930714654557307 | 1.988 |
| 0.999657907148623 | 1.226 |
| 0.09593818629300768 | 1.102 |
| 0.9347536472940716 | 1.235 |
| -0.3536126056950456 | 1.909 |
| 0.49554307814577014 | 1.332 |
| -0.9252277032882377 | 1.037 |
| -0.649095128328217 | 1.22 |
| -0.7257518511952609 | 1.581 |
| 0.8149973951162376 | 1.023 |
| -0.9046561588119699 | 1.179 |
| -0.45265334898651594 | 1.218 |
| 0.2877130681813 | 1.791 |
| 0.9976273431965318 | 1.306 |
| -0.9851297044260359 | 1.524 |
| 0.747220436141166 | 1.102 |
| 0.10497001506017842 | 1.42 |
| -0.6195011355741546 | 1.848 |
| 0.6780162609677329 | 1.639 |
| -0.3798062162097067 | 1.461 |